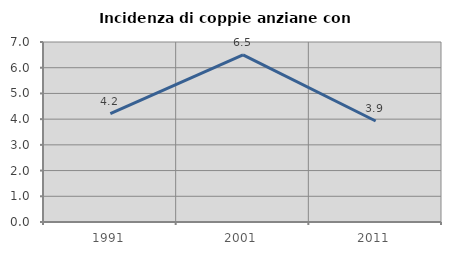
| Category | Incidenza di coppie anziane con figli |
|---|---|
| 1991.0 | 4.217 |
| 2001.0 | 6.502 |
| 2011.0 | 3.929 |